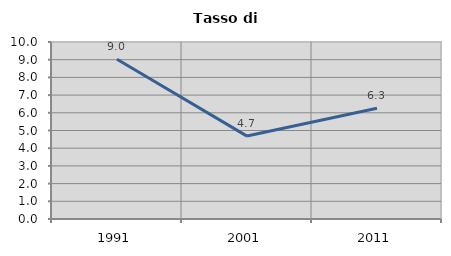
| Category | Tasso di disoccupazione   |
|---|---|
| 1991.0 | 9.024 |
| 2001.0 | 4.685 |
| 2011.0 | 6.258 |